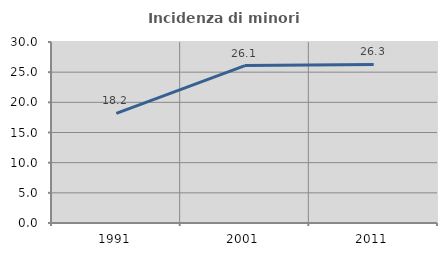
| Category | Incidenza di minori stranieri |
|---|---|
| 1991.0 | 18.182 |
| 2001.0 | 26.087 |
| 2011.0 | 26.277 |